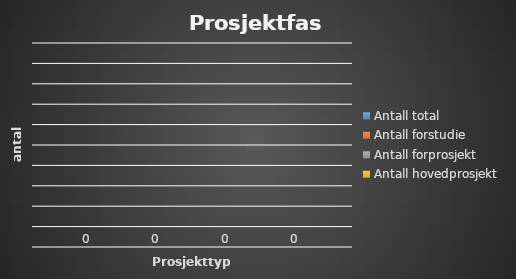
| Category | Antall total | Antall forstudie | Antall forprosjekt | Antall hovedprosjekt |
|---|---|---|---|---|
| 0 | 0 | 0 | 0 | 0 |